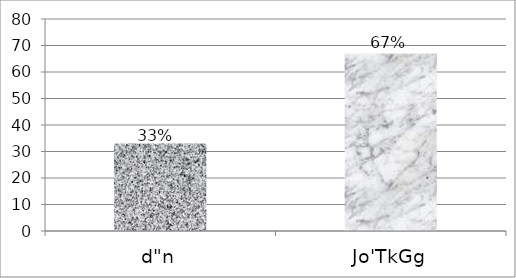
| Category | Series 0 |
|---|---|
| d"n | 33 |
| Jo'TkGg | 67 |